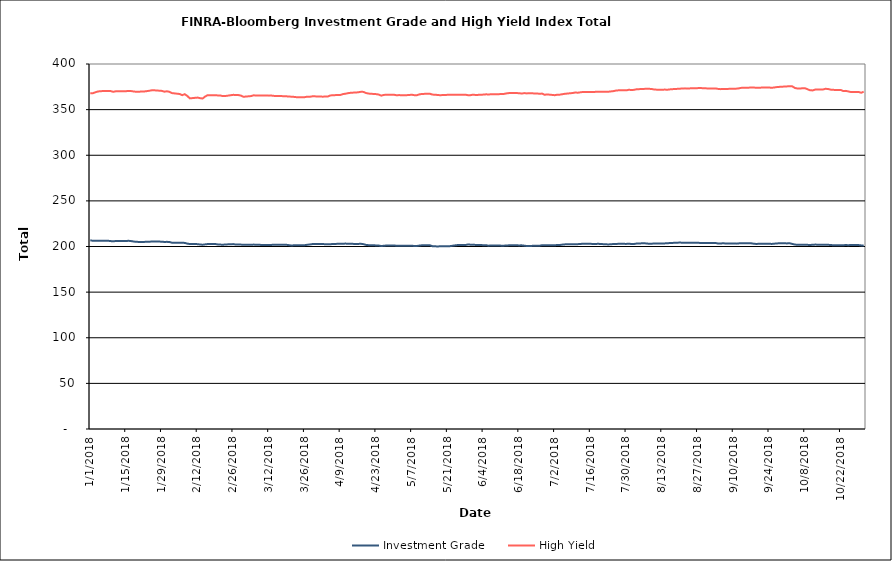
| Category | Investment Grade | High Yield |
|---|---|---|
| 1/1/18 | 206.865 | 367.892 |
| 1/2/18 | 206.236 | 367.981 |
| 1/3/18 | 206.358 | 368.997 |
| 1/4/18 | 206.214 | 369.868 |
| 1/5/18 | 206.21 | 370.223 |
| 1/8/18 | 206.268 | 370.533 |
| 1/9/18 | 205.924 | 370.325 |
| 1/10/18 | 205.698 | 369.516 |
| 1/11/18 | 206.019 | 370.071 |
| 1/12/18 | 206.029 | 370.201 |
| 1/15/18 | 206.029 | 370.201 |
| 1/16/18 | 206.243 | 370.532 |
| 1/17/18 | 205.936 | 370.334 |
| 1/18/18 | 205.462 | 369.876 |
| 1/19/18 | 205.093 | 369.578 |
| 1/22/18 | 204.95 | 369.869 |
| 1/23/18 | 205.272 | 370.191 |
| 1/24/18 | 205.1 | 370.631 |
| 1/25/18 | 205.504 | 371.115 |
| 1/26/18 | 205.532 | 371.196 |
| 1/29/18 | 205.294 | 370.548 |
| 1/30/18 | 204.979 | 369.661 |
| 1/31/18 | 205.098 | 370.087 |
| 2/1/18 | 204.944 | 369.568 |
| 2/2/18 | 204.178 | 368.112 |
| 2/5/18 | 204.038 | 367.136 |
| 2/6/18 | 204.095 | 365.863 |
| 2/7/18 | 203.934 | 366.902 |
| 2/8/18 | 203.185 | 364.997 |
| 2/9/18 | 202.662 | 362.325 |
| 2/12/18 | 202.596 | 363.207 |
| 2/13/18 | 202.217 | 362.548 |
| 2/14/18 | 201.952 | 362.185 |
| 2/15/18 | 202.341 | 364.346 |
| 2/16/18 | 202.676 | 365.858 |
| 2/19/18 | 202.676 | 365.858 |
| 2/20/18 | 202.241 | 365.533 |
| 2/21/18 | 202.077 | 365.42 |
| 2/22/18 | 201.968 | 364.794 |
| 2/23/18 | 202.224 | 364.946 |
| 2/26/18 | 202.627 | 366.203 |
| 2/27/18 | 202.125 | 366.044 |
| 2/28/18 | 202.11 | 365.977 |
| 3/1/18 | 202.091 | 365.376 |
| 3/2/18 | 201.793 | 364.078 |
| 3/5/18 | 201.862 | 364.847 |
| 3/6/18 | 202.078 | 365.692 |
| 3/7/18 | 201.963 | 365.478 |
| 3/8/18 | 202.026 | 365.471 |
| 3/9/18 | 201.651 | 365.539 |
| 3/12/18 | 201.632 | 365.337 |
| 3/13/18 | 201.745 | 365.388 |
| 3/14/18 | 201.97 | 365.058 |
| 3/15/18 | 201.911 | 364.876 |
| 3/16/18 | 201.965 | 364.95 |
| 3/19/18 | 201.815 | 364.55 |
| 3/20/18 | 201.386 | 364.279 |
| 3/21/18 | 201.054 | 364.195 |
| 3/22/18 | 201.426 | 363.894 |
| 3/23/18 | 201.269 | 363.557 |
| 3/26/18 | 201.407 | 363.656 |
| 3/27/18 | 201.895 | 364.228 |
| 3/28/18 | 202.221 | 364.089 |
| 3/29/18 | 202.639 | 364.548 |
| 3/30/18 | 202.639 | 364.548 |
| 4/2/18 | 202.723 | 364.217 |
| 4/3/18 | 202.506 | 364.286 |
| 4/4/18 | 202.534 | 364.286 |
| 4/5/18 | 202.436 | 365.501 |
| 4/6/18 | 202.796 | 365.788 |
| 4/9/18 | 202.961 | 366.085 |
| 4/10/18 | 203.035 | 367.052 |
| 4/11/18 | 203.195 | 367.445 |
| 4/12/18 | 202.944 | 368.039 |
| 4/13/18 | 202.901 | 368.445 |
| 4/16/18 | 202.827 | 368.982 |
| 4/17/18 | 202.981 | 369.527 |
| 4/18/18 | 202.569 | 369.434 |
| 4/19/18 | 201.785 | 368.211 |
| 4/20/18 | 201.48 | 367.589 |
| 4/23/18 | 201.193 | 366.964 |
| 4/24/18 | 201.02 | 366.512 |
| 4/25/18 | 200.527 | 365.31 |
| 4/26/18 | 200.81 | 366.127 |
| 4/27/18 | 201.055 | 366.265 |
| 4/30/18 | 201.158 | 366.328 |
| 5/1/18 | 200.773 | 365.704 |
| 5/2/18 | 200.693 | 365.948 |
| 5/3/18 | 200.871 | 365.697 |
| 5/4/18 | 200.72 | 365.613 |
| 5/7/18 | 200.796 | 366.32 |
| 5/8/18 | 200.584 | 365.795 |
| 5/9/18 | 200.607 | 365.84 |
| 5/10/18 | 201.039 | 366.743 |
| 5/11/18 | 201.344 | 367.197 |
| 5/14/18 | 201.332 | 367.421 |
| 5/15/18 | 200.385 | 366.487 |
| 5/16/18 | 200.263 | 366.342 |
| 5/17/18 | 200.023 | 366.084 |
| 5/18/18 | 200.234 | 365.813 |
| 5/21/18 | 200.388 | 366.206 |
| 5/22/18 | 200.409 | 366.367 |
| 5/23/18 | 200.848 | 366.335 |
| 5/24/18 | 201.258 | 366.279 |
| 5/25/18 | 201.609 | 366.393 |
| 5/28/18 | 201.609 | 366.393 |
| 5/29/18 | 202.227 | 365.778 |
| 5/30/18 | 201.982 | 365.888 |
| 5/31/18 | 202.056 | 366.404 |
| 6/1/18 | 201.661 | 366.018 |
| 6/4/18 | 201.476 | 366.472 |
| 6/5/18 | 201.464 | 366.75 |
| 6/6/18 | 200.899 | 366.654 |
| 6/7/18 | 201.088 | 366.763 |
| 6/8/18 | 201.179 | 366.746 |
| 6/11/18 | 200.941 | 367.06 |
| 6/12/18 | 200.944 | 367.199 |
| 6/13/18 | 201.001 | 367.776 |
| 6/14/18 | 201.296 | 368.126 |
| 6/15/18 | 201.48 | 368.156 |
| 6/18/18 | 201.203 | 368.064 |
| 6/19/18 | 201.264 | 367.584 |
| 6/20/18 | 200.902 | 368.12 |
| 6/21/18 | 200.538 | 367.768 |
| 6/22/18 | 200.647 | 368.003 |
| 6/25/18 | 200.747 | 367.625 |
| 6/26/18 | 200.862 | 367.43 |
| 6/27/18 | 201.381 | 367.56 |
| 6/28/18 | 201.268 | 366.286 |
| 6/29/18 | 201.482 | 366.683 |
| 7/2/18 | 201.363 | 365.801 |
| 7/3/18 | 201.674 | 366.425 |
| 7/4/18 | 201.674 | 366.425 |
| 7/5/18 | 202.071 | 366.925 |
| 7/6/18 | 202.349 | 367.366 |
| 7/9/18 | 202.425 | 368.212 |
| 7/10/18 | 202.482 | 368.743 |
| 7/11/18 | 202.564 | 368.552 |
| 7/12/18 | 202.769 | 368.96 |
| 7/13/18 | 203.05 | 369.352 |
| 7/16/18 | 202.904 | 369.443 |
| 7/17/18 | 202.825 | 369.324 |
| 7/18/18 | 202.783 | 369.485 |
| 7/19/18 | 202.956 | 369.501 |
| 7/20/18 | 202.716 | 369.629 |
| 7/23/18 | 202.256 | 369.628 |
| 7/24/18 | 202.488 | 369.978 |
| 7/25/18 | 202.705 | 370.297 |
| 7/26/18 | 202.761 | 370.919 |
| 7/27/18 | 202.965 | 371.144 |
| 7/30/18 | 202.856 | 371.147 |
| 7/31/18 | 203.097 | 371.747 |
| 8/1/18 | 202.713 | 371.487 |
| 8/2/18 | 202.773 | 371.679 |
| 8/3/18 | 203.214 | 372.305 |
| 8/6/18 | 203.574 | 372.715 |
| 8/7/18 | 203.267 | 372.958 |
| 8/8/18 | 202.999 | 372.802 |
| 8/9/18 | 203.111 | 372.559 |
| 8/10/18 | 203.256 | 371.985 |
| 8/13/18 | 203.248 | 371.683 |
| 8/14/18 | 203.391 | 371.999 |
| 8/15/18 | 203.641 | 371.772 |
| 8/16/18 | 203.733 | 372.168 |
| 8/17/18 | 203.926 | 372.41 |
| 8/20/18 | 204.314 | 372.942 |
| 8/21/18 | 204.132 | 373.187 |
| 8/22/18 | 204.145 | 373.293 |
| 8/23/18 | 204.165 | 373.205 |
| 8/24/18 | 204.143 | 373.291 |
| 8/27/18 | 204.122 | 373.565 |
| 8/28/18 | 203.864 | 373.642 |
| 8/29/18 | 203.7 | 373.495 |
| 8/30/18 | 203.77 | 373.324 |
| 8/31/18 | 203.831 | 373.233 |
| 9/3/18 | 203.831 | 373.233 |
| 9/4/18 | 203.242 | 372.692 |
| 9/5/18 | 203.269 | 372.444 |
| 9/6/18 | 203.637 | 372.733 |
| 9/7/18 | 203.185 | 372.674 |
| 9/10/18 | 203.37 | 372.852 |
| 9/11/18 | 203.134 | 372.963 |
| 9/12/18 | 203.407 | 373.297 |
| 9/13/18 | 203.605 | 373.833 |
| 9/14/18 | 203.463 | 373.927 |
| 9/17/18 | 203.466 | 374.179 |
| 9/18/18 | 203.037 | 374.23 |
| 9/19/18 | 202.756 | 373.853 |
| 9/20/18 | 203.078 | 373.976 |
| 9/21/18 | 203.131 | 374.155 |
| 9/24/18 | 202.983 | 374.196 |
| 9/25/18 | 202.825 | 373.935 |
| 9/26/18 | 203.115 | 374.308 |
| 9/27/18 | 203.378 | 374.725 |
| 9/28/18 | 203.529 | 374.94 |
| 10/1/18 | 203.411 | 375.475 |
| 10/2/18 | 203.54 | 375.702 |
| 10/3/18 | 202.822 | 375.539 |
| 10/4/18 | 202.191 | 373.8 |
| 10/5/18 | 201.812 | 373.135 |
| 10/8/18 | 201.939 | 373.424 |
| 10/9/18 | 201.82 | 372.312 |
| 10/10/18 | 201.559 | 371.131 |
| 10/11/18 | 201.989 | 371.075 |
| 10/12/18 | 202.069 | 371.98 |
| 10/15/18 | 201.945 | 372.054 |
| 10/16/18 | 201.996 | 372.804 |
| 10/17/18 | 201.894 | 372.649 |
| 10/18/18 | 201.613 | 371.926 |
| 10/19/18 | 201.423 | 371.656 |
| 10/22/18 | 201.392 | 371.541 |
| 10/23/18 | 201.399 | 370.348 |
| 10/24/18 | 201.624 | 370.545 |
| 10/25/18 | 201.4 | 369.922 |
| 10/26/18 | 201.67 | 369.266 |
| 10/29/18 | 201.55 | 369.33 |
| 10/30/18 | 201.188 | 368.514 |
| 10/31/18 | 200.926 | 369.575 |